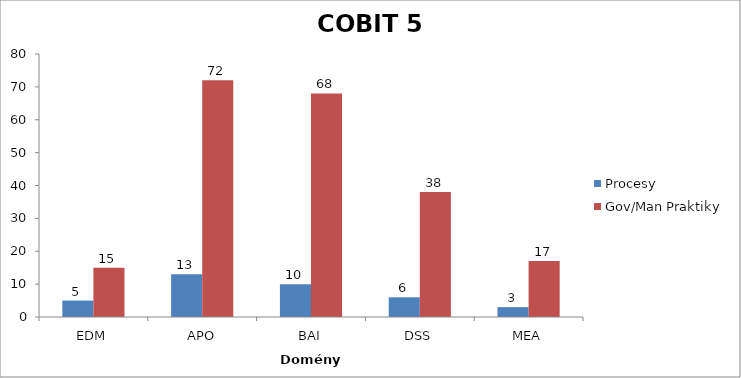
| Category | Procesy | Gov/Man Praktiky |
|---|---|---|
| EDM | 5 | 15 |
| APO | 13 | 72 |
| BAI | 10 | 68 |
| DSS | 6 | 38 |
| MEA | 3 | 17 |